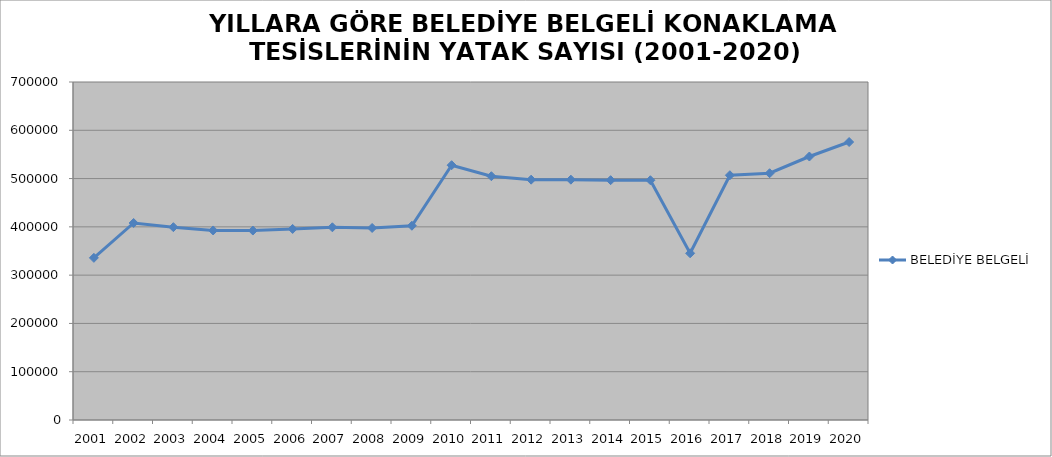
| Category | BELEDİYE BELGELİ |
|---|---|
| 2001 | 335825 |
| 2002 | 408005 |
| 2003 | 399369 |
| 2004 | 392582 |
| 2005 | 392338 |
| 2006 | 395671 |
| 2007 | 399110 |
| 2008 | 397684 |
| 2009 | 402289 |
| 2010 | 527712 |
| 2011 | 504877 |
| 2012 | 497728 |
| 2013 | 497728 |
| 2014 | 496697 |
| 2015 | 496574 |
| 2016 | 345267 |
| 2017 | 506934 |
| 2018 | 511076 |
| 2019 | 545669 |
| 2020 | 575682 |